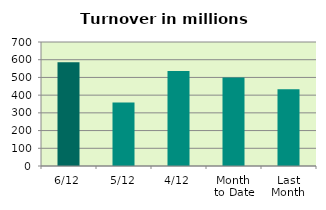
| Category | Series 0 |
|---|---|
| 6/12 | 585.658 |
| 5/12 | 357.823 |
| 4/12 | 536.385 |
| Month 
to Date | 499.337 |
| Last
Month | 433.001 |